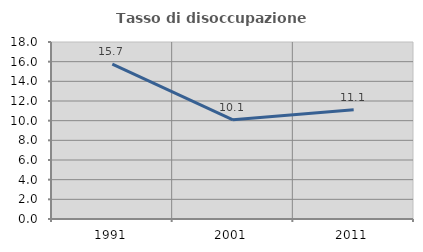
| Category | Tasso di disoccupazione giovanile  |
|---|---|
| 1991.0 | 15.741 |
| 2001.0 | 10.092 |
| 2011.0 | 11.111 |